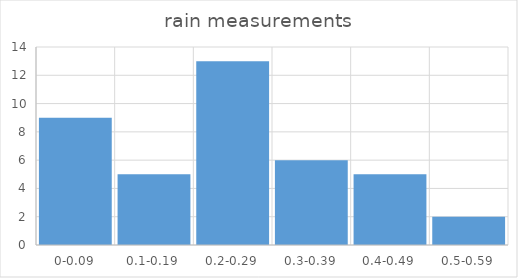
| Category | freq |
|---|---|
| 0-0.09 | 9 |
| 0.1-0.19 | 5 |
| 0.2-0.29 | 13 |
| 0.3-0.39 | 6 |
| 0.4-0.49 | 5 |
| 0.5-0.59 | 2 |